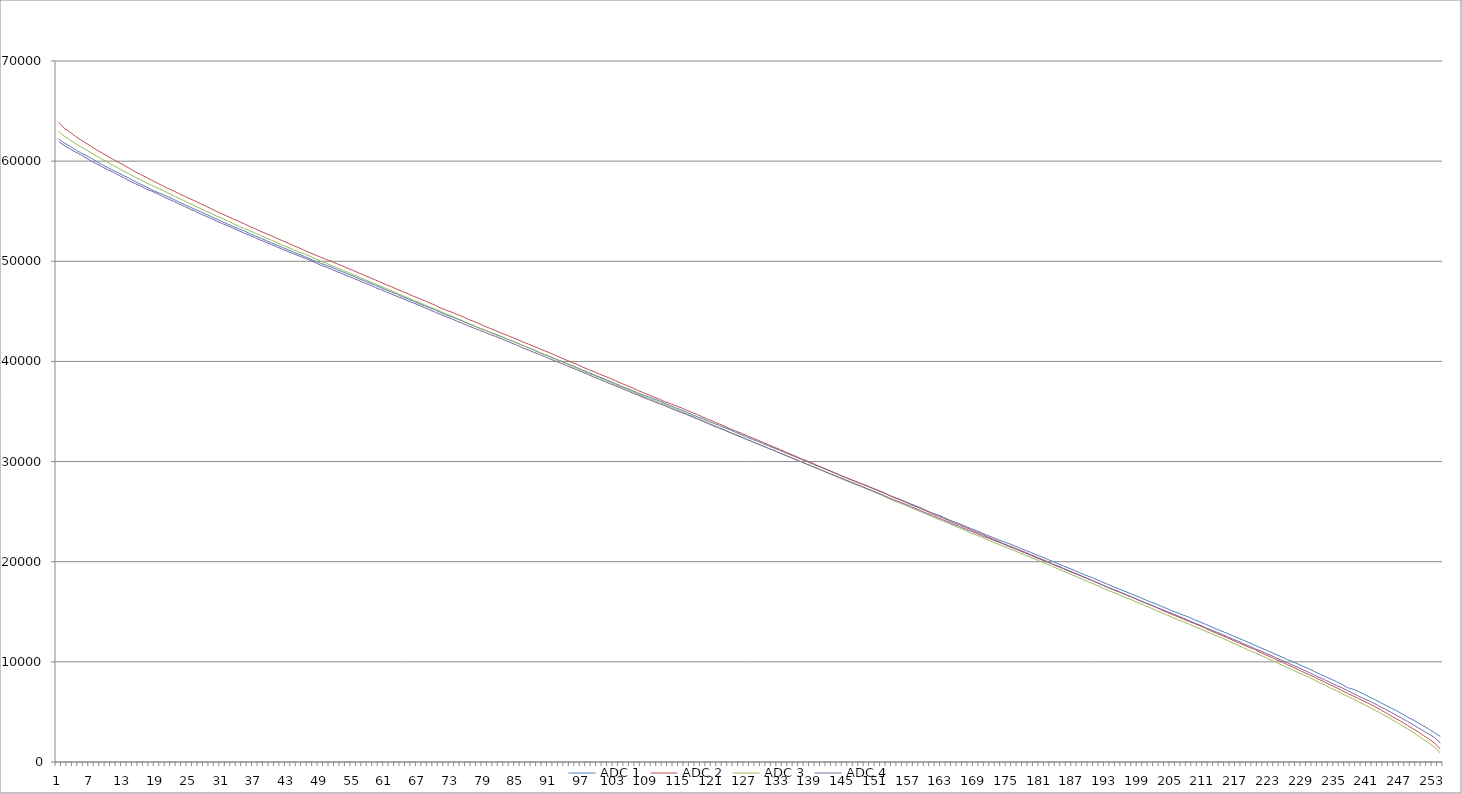
| Category | ADC 1 | ADC 2 | ADC 3 | ADC 4 |
|---|---|---|---|---|
| 0 | 62208 | 63872 | 62976 | 61952 |
| 1 | 61824 | 63300 | 62484 | 61572 |
| 2 | 61504 | 62928 | 62138 | 61240 |
| 3 | 61152 | 62504 | 61776 | 60928 |
| 4 | 60840 | 62134 | 61460 | 60642 |
| 5 | 60576 | 61792 | 61136 | 60328 |
| 6 | 60264 | 61456 | 60809 | 60000 |
| 7 | 59935 | 61104 | 60480 | 59711 |
| 8 | 59629 | 60790 | 60180 | 59420 |
| 9 | 59352 | 60484 | 59880 | 59132 |
| 10 | 59079 | 60170 | 59584 | 58882 |
| 11 | 58816 | 59872 | 59266 | 58593 |
| 12 | 58528 | 59570 | 58989 | 58304 |
| 13 | 58256 | 59270 | 58688 | 58016 |
| 14 | 57960 | 58944 | 58398 | 57752 |
| 15 | 57696 | 58656 | 58124 | 57504 |
| 16 | 57440 | 58387 | 57832 | 57222 |
| 17 | 57152 | 58104 | 57597 | 57008 |
| 18 | 56912 | 57826 | 57344 | 56768 |
| 19 | 56692 | 57544 | 57088 | 56488 |
| 20 | 56442 | 57272 | 56832 | 56224 |
| 21 | 56193 | 57032 | 56558 | 56000 |
| 22 | 55930 | 56766 | 56284 | 55737 |
| 23 | 55680 | 56508 | 56048 | 55489 |
| 24 | 55426 | 56263 | 55760 | 55224 |
| 25 | 55172 | 56008 | 55513 | 54988 |
| 26 | 54942 | 55748 | 55264 | 54720 |
| 27 | 54688 | 55492 | 55000 | 54490 |
| 28 | 54440 | 55228 | 54766 | 54248 |
| 29 | 54208 | 54960 | 54496 | 53990 |
| 30 | 53948 | 54706 | 54274 | 53760 |
| 31 | 53707 | 54461 | 54016 | 53526 |
| 32 | 53472 | 54216 | 53759 | 53296 |
| 33 | 53242 | 53972 | 53504 | 53046 |
| 34 | 53024 | 53736 | 53264 | 52800 |
| 35 | 52765 | 53472 | 53056 | 52583 |
| 36 | 52536 | 53248 | 52816 | 52348 |
| 37 | 52299 | 52988 | 52562 | 52104 |
| 38 | 52064 | 52768 | 52319 | 51892 |
| 39 | 51824 | 52528 | 52092 | 51648 |
| 40 | 51608 | 52284 | 51864 | 51429 |
| 41 | 51368 | 52044 | 51608 | 51184 |
| 42 | 51156 | 51808 | 51388 | 50976 |
| 43 | 50916 | 51567 | 51152 | 50738 |
| 44 | 50704 | 51344 | 50948 | 50540 |
| 45 | 50476 | 51096 | 50720 | 50324 |
| 46 | 50244 | 50847 | 50508 | 50112 |
| 47 | 50012 | 50622 | 50240 | 49856 |
| 48 | 49800 | 50400 | 50020 | 49616 |
| 49 | 49600 | 50180 | 49800 | 49413 |
| 50 | 49408 | 49984 | 49568 | 49192 |
| 51 | 49162 | 49736 | 49344 | 48960 |
| 52 | 48944 | 49524 | 49100 | 48737 |
| 53 | 48714 | 49279 | 48880 | 48514 |
| 54 | 48504 | 49072 | 48642 | 48294 |
| 55 | 48256 | 48824 | 48424 | 48074 |
| 56 | 48044 | 48594 | 48177 | 47824 |
| 57 | 47816 | 48365 | 47954 | 47617 |
| 58 | 47594 | 48124 | 47744 | 47376 |
| 59 | 47360 | 47900 | 47504 | 47156 |
| 60 | 47144 | 47648 | 47272 | 46947 |
| 61 | 46908 | 47444 | 47028 | 46704 |
| 62 | 46696 | 47196 | 46797 | 46480 |
| 63 | 46452 | 46968 | 46572 | 46274 |
| 64 | 46224 | 46753 | 46340 | 46036 |
| 65 | 46003 | 46497 | 46096 | 45832 |
| 66 | 45772 | 46292 | 45896 | 45602 |
| 67 | 45550 | 46056 | 45656 | 45362 |
| 68 | 45346 | 45824 | 45422 | 45137 |
| 69 | 45120 | 45600 | 45216 | 44896 |
| 70 | 44871 | 45320 | 44968 | 44672 |
| 71 | 44640 | 45104 | 44728 | 44448 |
| 72 | 44444 | 44910 | 44529 | 44244 |
| 73 | 44232 | 44676 | 44288 | 44004 |
| 74 | 44000 | 44480 | 44057 | 43788 |
| 75 | 43776 | 44204 | 43822 | 43552 |
| 76 | 43560 | 44000 | 43584 | 43343 |
| 77 | 43328 | 43776 | 43352 | 43122 |
| 78 | 43120 | 43518 | 43152 | 42909 |
| 79 | 42913 | 43294 | 42907 | 42686 |
| 80 | 42721 | 43066 | 42664 | 42492 |
| 81 | 42500 | 42832 | 42462 | 42277 |
| 82 | 42272 | 42633 | 42240 | 42048 |
| 83 | 42044 | 42405 | 42038 | 41821 |
| 84 | 41824 | 42192 | 41824 | 41596 |
| 85 | 41592 | 41952 | 41608 | 41344 |
| 86 | 41372 | 41732 | 41360 | 41136 |
| 87 | 41152 | 41512 | 41116 | 40910 |
| 88 | 40908 | 41288 | 40898 | 40705 |
| 89 | 40688 | 41060 | 40668 | 40476 |
| 90 | 40480 | 40836 | 40450 | 40248 |
| 91 | 40248 | 40589 | 40199 | 40026 |
| 92 | 40032 | 40368 | 39992 | 39808 |
| 93 | 39808 | 40128 | 39756 | 39581 |
| 94 | 39584 | 39888 | 39528 | 39360 |
| 95 | 39360 | 39681 | 39288 | 39124 |
| 96 | 39112 | 39422 | 39056 | 38912 |
| 97 | 38912 | 39199 | 38820 | 38684 |
| 98 | 38679 | 38980 | 38592 | 38428 |
| 99 | 38448 | 38736 | 38368 | 38208 |
| 100 | 38238 | 38528 | 38140 | 37992 |
| 101 | 38012 | 38305 | 37903 | 37764 |
| 102 | 37777 | 38056 | 37666 | 37551 |
| 103 | 37535 | 37816 | 37457 | 37326 |
| 104 | 37328 | 37600 | 37256 | 37106 |
| 105 | 37103 | 37380 | 36987 | 36864 |
| 106 | 36860 | 37111 | 36748 | 36656 |
| 107 | 36664 | 36900 | 36532 | 36425 |
| 108 | 36456 | 36672 | 36304 | 36194 |
| 109 | 36255 | 36439 | 36114 | 35976 |
| 110 | 36065 | 36232 | 35888 | 35788 |
| 111 | 35814 | 35968 | 35672 | 35581 |
| 112 | 35600 | 35794 | 35456 | 35328 |
| 113 | 35372 | 35586 | 35216 | 35119 |
| 114 | 35154 | 35364 | 35000 | 34898 |
| 115 | 34915 | 35120 | 34756 | 34696 |
| 116 | 34686 | 34896 | 34538 | 34472 |
| 117 | 34464 | 34688 | 34308 | 34234 |
| 118 | 34264 | 34436 | 34074 | 34017 |
| 119 | 34032 | 34192 | 33847 | 33780 |
| 120 | 33810 | 33980 | 33600 | 33528 |
| 121 | 33600 | 33742 | 33375 | 33336 |
| 122 | 33364 | 33522 | 33160 | 33116 |
| 123 | 33150 | 33264 | 32920 | 32866 |
| 124 | 32908 | 33037 | 32688 | 32654 |
| 125 | 32688 | 32832 | 32483 | 32430 |
| 126 | 32459 | 32595 | 32232 | 32206 |
| 127 | 32224 | 32361 | 32000 | 31984 |
| 128 | 32024 | 32150 | 31786 | 31762 |
| 129 | 31784 | 31906 | 31544 | 31546 |
| 130 | 31576 | 31680 | 31321 | 31316 |
| 131 | 31344 | 31440 | 31104 | 31104 |
| 132 | 31136 | 31224 | 30856 | 30872 |
| 133 | 30898 | 30975 | 30639 | 30648 |
| 134 | 30669 | 30752 | 30420 | 30416 |
| 135 | 30453 | 30520 | 30174 | 30210 |
| 136 | 30236 | 30284 | 29962 | 29985 |
| 137 | 30012 | 30076 | 29728 | 29744 |
| 138 | 29776 | 29845 | 29505 | 29536 |
| 139 | 29552 | 29592 | 29280 | 29296 |
| 140 | 29328 | 29378 | 29056 | 29076 |
| 141 | 29117 | 29136 | 28817 | 28853 |
| 142 | 28874 | 28910 | 28592 | 28636 |
| 143 | 28672 | 28656 | 28350 | 28424 |
| 144 | 28424 | 28432 | 28124 | 28196 |
| 145 | 28198 | 28230 | 27906 | 27976 |
| 146 | 27992 | 28008 | 27685 | 27760 |
| 147 | 27768 | 27788 | 27471 | 27536 |
| 148 | 27592 | 27570 | 27248 | 27308 |
| 149 | 27366 | 27326 | 27036 | 27092 |
| 150 | 27128 | 27107 | 26800 | 26868 |
| 151 | 26928 | 26896 | 26566 | 26656 |
| 152 | 26656 | 26640 | 26306 | 26390 |
| 153 | 26436 | 26398 | 26072 | 26168 |
| 154 | 26238 | 26193 | 25872 | 25974 |
| 155 | 26007 | 25960 | 25664 | 25748 |
| 156 | 25788 | 25712 | 25408 | 25528 |
| 157 | 25573 | 25503 | 25184 | 25304 |
| 158 | 25350 | 25264 | 24958 | 25062 |
| 159 | 25088 | 25038 | 24721 | 24832 |
| 160 | 24864 | 24800 | 24496 | 24624 |
| 161 | 24668 | 24574 | 24256 | 24386 |
| 162 | 24440 | 24344 | 24040 | 24167 |
| 163 | 24200 | 24110 | 23815 | 23948 |
| 164 | 23992 | 23856 | 23592 | 23706 |
| 165 | 23776 | 23680 | 23360 | 23496 |
| 166 | 23558 | 23440 | 23130 | 23280 |
| 167 | 23317 | 23216 | 22880 | 23056 |
| 168 | 23116 | 22973 | 22681 | 22848 |
| 169 | 22880 | 22748 | 22432 | 22600 |
| 170 | 22652 | 22504 | 22208 | 22400 |
| 171 | 22433 | 22284 | 21976 | 22178 |
| 172 | 22207 | 22050 | 21762 | 21984 |
| 173 | 22014 | 21816 | 21530 | 21760 |
| 174 | 21813 | 21590 | 21316 | 21524 |
| 175 | 21600 | 21376 | 21104 | 21316 |
| 176 | 21360 | 21160 | 20875 | 21082 |
| 177 | 21150 | 20944 | 20660 | 20868 |
| 178 | 20926 | 20710 | 20428 | 20624 |
| 179 | 20700 | 20482 | 20208 | 20396 |
| 180 | 20498 | 20256 | 19976 | 20176 |
| 181 | 20257 | 20040 | 19756 | 19971 |
| 182 | 20040 | 19775 | 19522 | 19744 |
| 183 | 19808 | 19585 | 19283 | 19510 |
| 184 | 19560 | 19328 | 19054 | 19296 |
| 185 | 19353 | 19112 | 18816 | 19054 |
| 186 | 19136 | 18892 | 18600 | 18839 |
| 187 | 18896 | 18652 | 18356 | 18616 |
| 188 | 18664 | 18424 | 18124 | 18388 |
| 189 | 18468 | 18195 | 17904 | 18178 |
| 190 | 18236 | 17960 | 17680 | 17953 |
| 191 | 18000 | 17712 | 17424 | 17701 |
| 192 | 17760 | 17476 | 17184 | 17470 |
| 193 | 17537 | 17264 | 16960 | 17230 |
| 194 | 17316 | 17044 | 16744 | 17018 |
| 195 | 17100 | 16794 | 16506 | 16808 |
| 196 | 16881 | 16572 | 16296 | 16567 |
| 197 | 16652 | 16352 | 16064 | 16360 |
| 198 | 16432 | 16096 | 15832 | 16128 |
| 199 | 16193 | 15882 | 15616 | 15900 |
| 200 | 15966 | 15658 | 15376 | 15688 |
| 201 | 15770 | 15436 | 15136 | 15456 |
| 202 | 15528 | 15166 | 14904 | 15236 |
| 203 | 15307 | 14940 | 14670 | 15016 |
| 204 | 15070 | 14710 | 14424 | 14800 |
| 205 | 14876 | 14482 | 14200 | 14580 |
| 206 | 14650 | 14250 | 13988 | 14356 |
| 207 | 14464 | 14030 | 13766 | 14112 |
| 208 | 14208 | 13820 | 13528 | 13888 |
| 209 | 13984 | 13601 | 13308 | 13660 |
| 210 | 13760 | 13352 | 13065 | 13426 |
| 211 | 13520 | 13091 | 12832 | 13200 |
| 212 | 13279 | 12855 | 12608 | 12978 |
| 213 | 13062 | 12640 | 12384 | 12752 |
| 214 | 12836 | 12416 | 12133 | 12508 |
| 215 | 12600 | 12168 | 11879 | 12288 |
| 216 | 12368 | 11924 | 11648 | 12052 |
| 217 | 12144 | 11676 | 11408 | 11808 |
| 218 | 11915 | 11456 | 11152 | 11584 |
| 219 | 11656 | 11232 | 10920 | 11328 |
| 220 | 11428 | 10952 | 10672 | 11108 |
| 221 | 11208 | 10717 | 10444 | 10864 |
| 222 | 10958 | 10478 | 10175 | 10656 |
| 223 | 10724 | 10208 | 9940 | 10366 |
| 224 | 10475 | 9986 | 9664 | 10144 |
| 225 | 10240 | 9719 | 9432 | 9911 |
| 226 | 10016 | 9472 | 9184 | 9664 |
| 227 | 9763 | 9232 | 8928 | 9432 |
| 228 | 9520 | 8958 | 8680 | 9184 |
| 229 | 9296 | 8700 | 8432 | 8928 |
| 230 | 9025 | 8464 | 8176 | 8664 |
| 231 | 8768 | 8192 | 7880 | 8408 |
| 232 | 8512 | 7936 | 7648 | 8158 |
| 233 | 8272 | 7666 | 7360 | 7904 |
| 234 | 8020 | 7418 | 7112 | 7648 |
| 235 | 7762 | 7137 | 6832 | 7408 |
| 236 | 7424 | 6848 | 6560 | 7136 |
| 237 | 7283 | 6608 | 6288 | 6860 |
| 238 | 7036 | 6336 | 6016 | 6589 |
| 239 | 6786 | 6080 | 5748 | 6336 |
| 240 | 6497 | 5816 | 5480 | 6080 |
| 241 | 6240 | 5536 | 5180 | 5826 |
| 242 | 5944 | 5230 | 4896 | 5524 |
| 243 | 5660 | 4928 | 4592 | 5248 |
| 244 | 5376 | 4584 | 4292 | 4956 |
| 245 | 5120 | 4300 | 3968 | 4651 |
| 246 | 4806 | 4000 | 3634 | 4365 |
| 247 | 4480 | 3648 | 3320 | 4048 |
| 248 | 4210 | 3327 | 2972 | 3736 |
| 249 | 3895 | 2994 | 2604 | 3400 |
| 250 | 3584 | 2612 | 2224 | 3072 |
| 251 | 3248 | 2272 | 1856 | 2752 |
| 252 | 2911 | 1872 | 1472 | 2432 |
| 253 | 2560 | 1280 | 896 | 1920 |